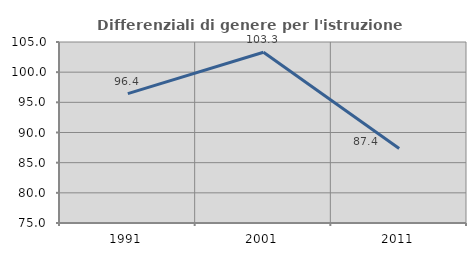
| Category | Differenziali di genere per l'istruzione superiore |
|---|---|
| 1991.0 | 96.444 |
| 2001.0 | 103.306 |
| 2011.0 | 87.359 |